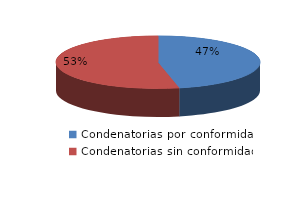
| Category | Series 0 |
|---|---|
| 0 | 28 |
| 1 | 32 |